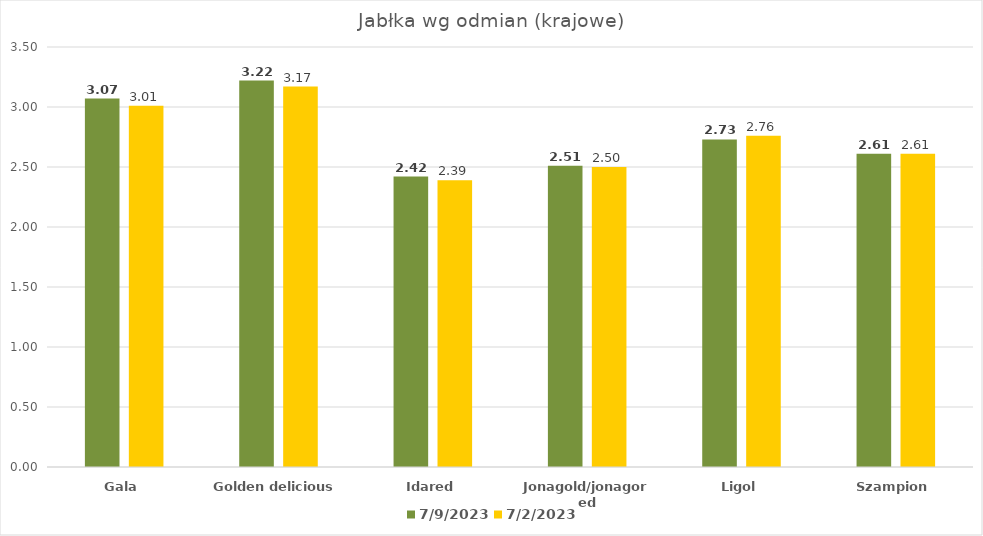
| Category | 09.07.2023 | 02.07.2023 |
|---|---|---|
| Gala | 3.07 | 3.01 |
| Golden delicious | 3.22 | 3.17 |
| Idared | 2.42 | 2.39 |
| Jonagold/jonagored | 2.51 | 2.5 |
| Ligol | 2.73 | 2.76 |
| Szampion | 2.61 | 2.61 |